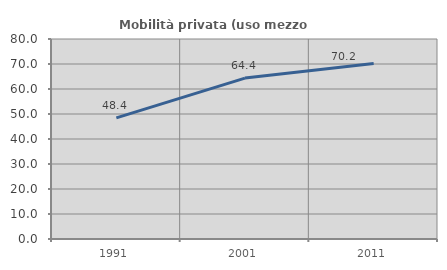
| Category | Mobilità privata (uso mezzo privato) |
|---|---|
| 1991.0 | 48.436 |
| 2001.0 | 64.354 |
| 2011.0 | 70.157 |